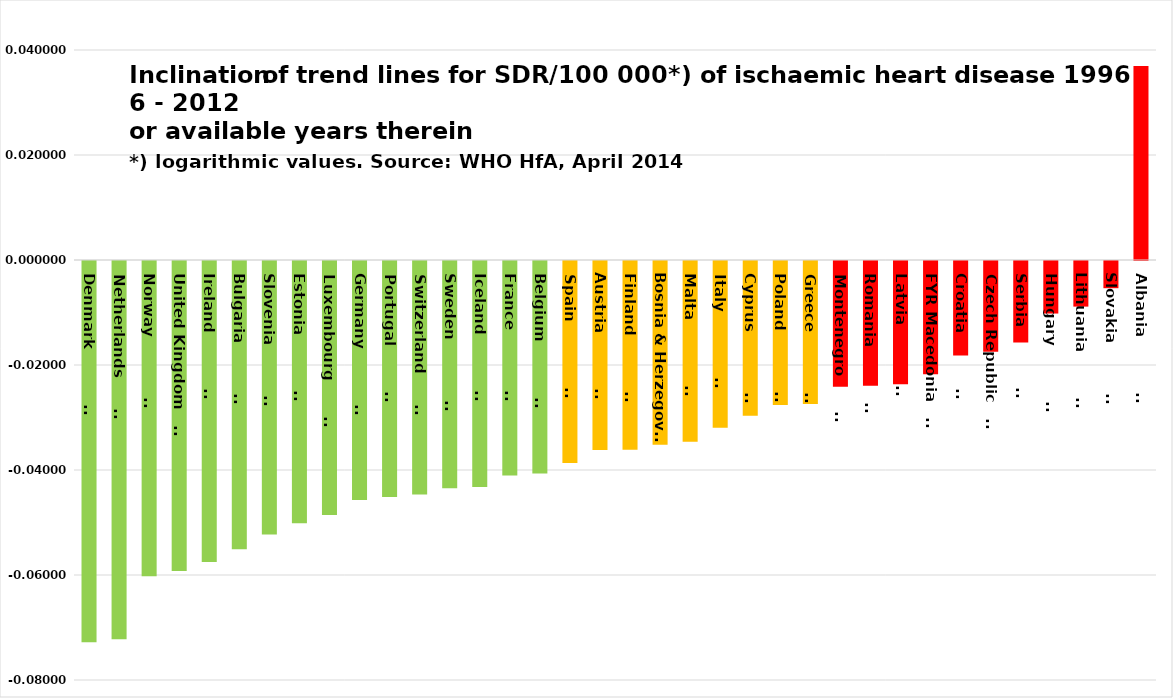
| Category | Series 0 |
|---|---|
| Denmark                | -0.073 |
| Netherlands            | -0.072 |
| Norway                 | -0.06 |
| United Kingdom         | -0.059 |
| Ireland                | -0.057 |
| Bulgaria               | -0.055 |
| Slovenia               | -0.052 |
| Estonia                | -0.05 |
| Luxembourg             | -0.048 |
| Germany                | -0.046 |
| Portugal               | -0.045 |
| Switzerland            | -0.044 |
| Sweden                 | -0.043 |
| Iceland                | -0.043 |
| France                 | -0.041 |
| Belgium                | -0.04 |
| Spain                  | -0.038 |
| Austria                | -0.036 |
| Finland                | -0.036 |
| Bosnia & Herzegovina | -0.035 |
| Malta                  | -0.034 |
| Italy                  | -0.032 |
| Cyprus                 | -0.029 |
| Poland                 | -0.027 |
| Greece                 | -0.027 |
| Montenegro             | -0.024 |
| Romania                | -0.024 |
| Latvia                 | -0.023 |
| FYR Macedonia         | -0.022 |
| Croatia                | -0.018 |
| Czech Republic         | -0.017 |
| Serbia                 | -0.016 |
| Hungary                | -0.01 |
| Lithuania              | -0.009 |
| Slovakia               | -0.005 |
| Albania                | 0.037 |